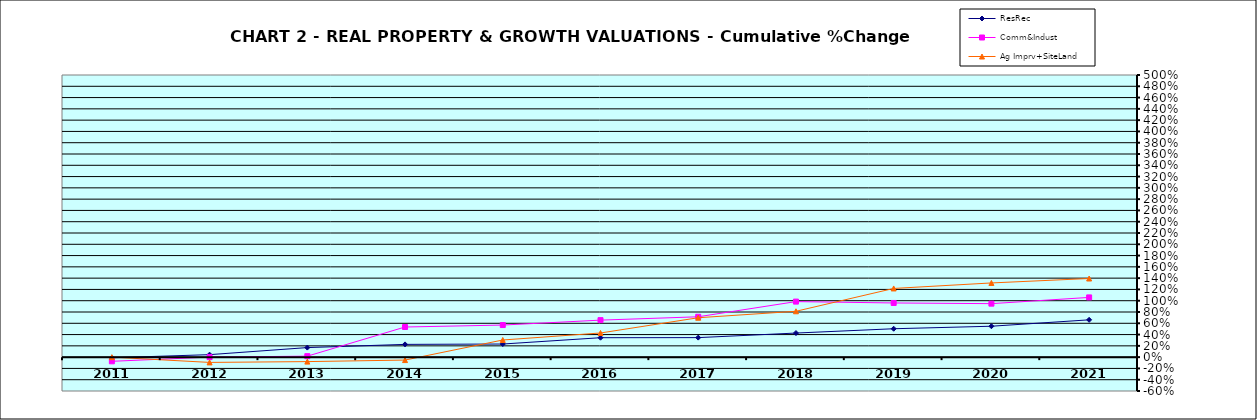
| Category | ResRec | Comm&Indust | Ag Imprv+SiteLand |
|---|---|---|---|
| 2011.0 | -0.012 | -0.074 | 0 |
| 2012.0 | 0.044 | 0.001 | -0.093 |
| 2013.0 | 0.169 | 0.017 | -0.079 |
| 2014.0 | 0.226 | 0.534 | -0.052 |
| 2015.0 | 0.232 | 0.569 | 0.304 |
| 2016.0 | 0.344 | 0.656 | 0.428 |
| 2017.0 | 0.346 | 0.715 | 0.698 |
| 2018.0 | 0.427 | 0.984 | 0.813 |
| 2019.0 | 0.503 | 0.96 | 1.217 |
| 2020.0 | 0.548 | 0.948 | 1.315 |
| 2021.0 | 0.661 | 1.059 | 1.394 |